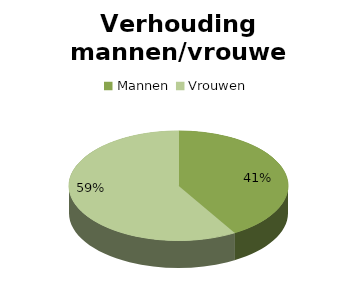
| Category | Series 0 |
|---|---|
| Mannen  | 170 |
| Vrouwen | 240 |